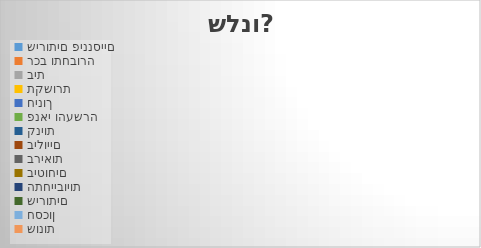
| Category | Series 0 |
|---|---|
| שירותים פיננסיים | 0 |
| רכב ותחבורה | 0 |
| בית | 0 |
| תקשורת | 0 |
| חינוך | 0 |
| פנאי והעשרה | 0 |
| קניות | 0 |
| בילויים | 0 |
| בריאות | 0 |
| ביטוחים | 0 |
| התחייבויות | 0 |
| שירותים | 0 |
| חסכון | 0 |
| שונות | 0 |